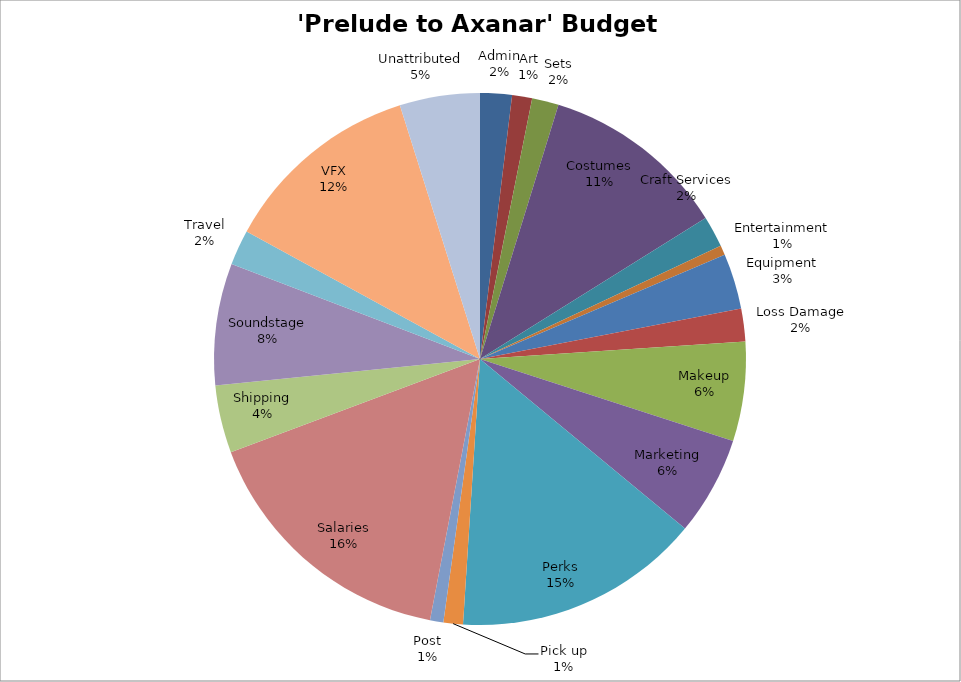
| Category | Amount |
|---|---|
| Admin | 2378.43 |
| Art | 1500 |
| Sets | 2000 |
| Costumes | 13986.66 |
| Craft Services | 2336.57 |
| Entertainment | 716.44 |
| Equipment | 4157.75 |
| Loss Damage | 2450.18 |
| Makeup | 7440 |
| Marketing | 7416.25 |
| Perks | 18515.63 |
| Pick up | 1460 |
| Post | 1000 |
| Salaries | 20085.97 |
| Shipping | 5059.1 |
| Soundstage | 9128 |
| Travel | 2651.39 |
| VFX | 15000 |
| Unattributed | 6002.89 |